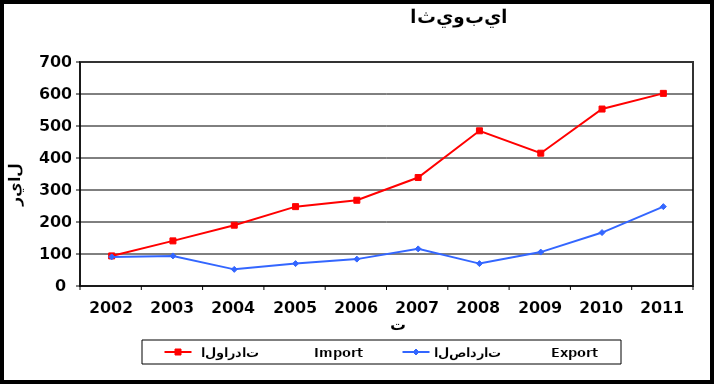
| Category |  الواردات           Import | الصادرات          Export |
|---|---|---|
| 2002.0 | 94 | 91 |
| 2003.0 | 141 | 94 |
| 2004.0 | 190 | 52 |
| 2005.0 | 248 | 70 |
| 2006.0 | 268 | 84 |
| 2007.0 | 339 | 116 |
| 2008.0 | 485 | 70 |
| 2009.0 | 415 | 106 |
| 2010.0 | 553 | 167 |
| 2011.0 | 602 | 248 |